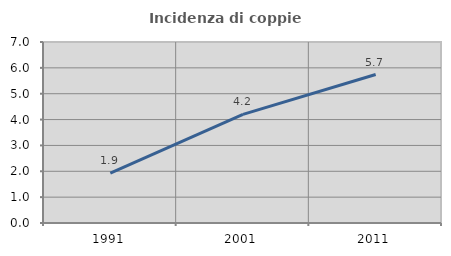
| Category | Incidenza di coppie miste |
|---|---|
| 1991.0 | 1.93 |
| 2001.0 | 4.199 |
| 2011.0 | 5.743 |